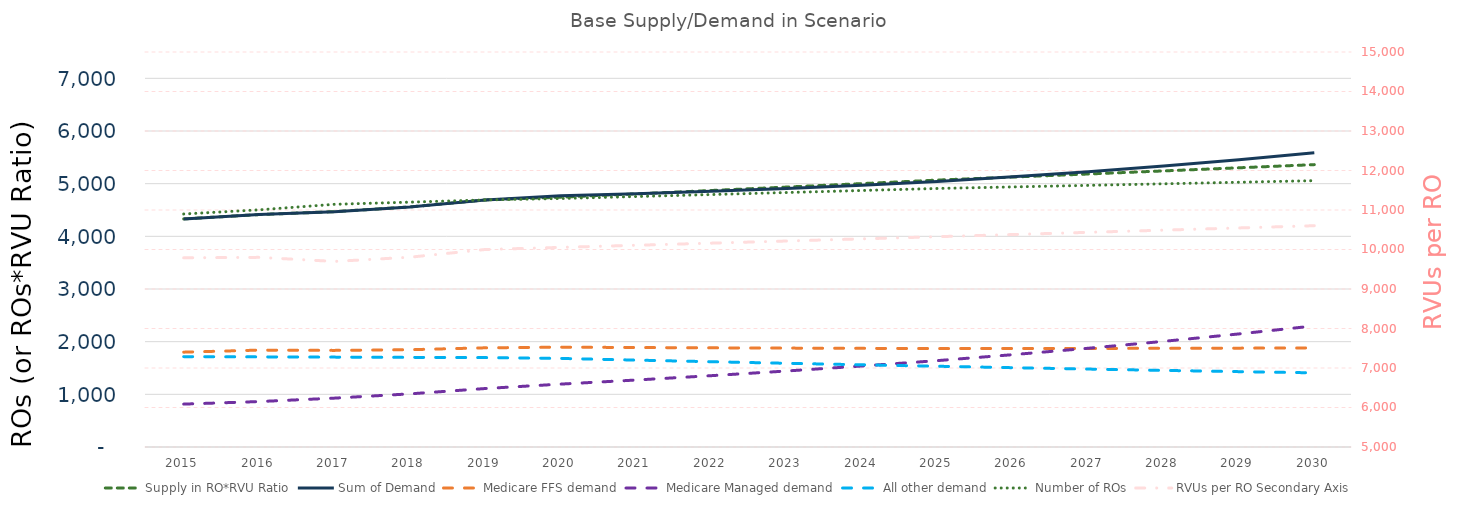
| Category | Supply in RO*RVU Ratio | Sum of Demand | Medicare FFS demand | Medicare Managed demand | All other demand | Number of ROs |
|---|---|---|---|---|---|---|
| 2015.0 | 4330.918 | 4330.918 | 1800.797 | 814.499 | 1715.622 | 4424 |
| 2016.0 | 4413.407 | 4413.407 | 1839.648 | 862.704 | 1711.056 | 4503 |
| 2017.0 | 4468.855 | 4468.855 | 1834.462 | 927.903 | 1706.489 | 4608 |
| 2018.0 | 4558.145 | 4558.145 | 1847.406 | 1008.817 | 1701.922 | 4649 |
| 2019.0 | 4691 | 4691 | 1883.294 | 1110.351 | 1697.355 | 4691 |
| 2020.0 | 4743.148 | 4771.219 | 1895.451 | 1194.081 | 1681.687 | 4718 |
| 2021.0 | 4806.429 | 4810.436 | 1889.019 | 1271.558 | 1649.859 | 4755.596 |
| 2022.0 | 4870.554 | 4856.666 | 1883.136 | 1354.443 | 1619.087 | 4793.492 |
| 2023.0 | 4935.534 | 4910.42 | 1877.856 | 1443.179 | 1589.384 | 4831.689 |
| 2024.0 | 5001.381 | 4972.246 | 1873.231 | 1538.255 | 1560.76 | 4870.191 |
| 2025.0 | 5068.106 | 5042.738 | 1869.313 | 1640.205 | 1533.221 | 4909 |
| 2026.0 | 5125.479 | 5129.048 | 1869.972 | 1753.195 | 1505.88 | 4938.249 |
| 2027.0 | 5183.502 | 5225.98 | 1871.474 | 1874.813 | 1479.694 | 4967.673 |
| 2028.0 | 5242.181 | 5334.335 | 1873.865 | 2005.818 | 1454.652 | 4997.272 |
| 2029.0 | 5301.525 | 5454.976 | 1877.191 | 2147.042 | 1430.744 | 5027.047 |
| 2030.0 | 5361.54 | 5588.832 | 1881.489 | 2299.391 | 1407.952 | 5057 |